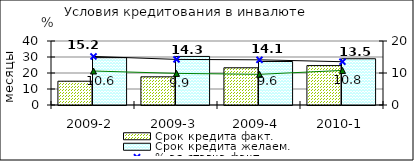
| Category | Срок кредита факт.  | Срок кредита желаем. |
|---|---|---|
| 2009-2 | 14.87 | 29.6 |
| 2009-3 | 17.62 | 30.36 |
| 2009-4 | 23.27 | 27.19 |
| 2010-1 | 24.63 | 28.91 |